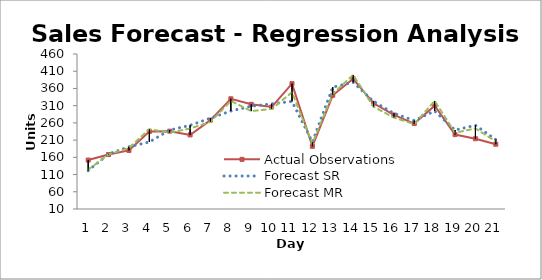
| Category | Actual Observations | Forecast SR | Forecast MR |
|---|---|---|---|
| 0 | 152 | 121.39 | 124.35 |
| 1 | 168 | 169.881 | 168.39 |
| 2 | 180 | 190.663 | 187.263 |
| 3 | 235 | 204.518 | 241.838 |
| 4 | 236 | 239.154 | 231.303 |
| 5 | 225 | 253.009 | 243.885 |
| 6 | 268 | 273.791 | 262.759 |
| 7 | 330 | 294.572 | 323.625 |
| 8 | 314 | 308.427 | 294.216 |
| 9 | 306 | 315.354 | 300.507 |
| 10 | 374 | 322.282 | 348.79 |
| 11 | 192 | 204.518 | 199.846 |
| 12 | 340 | 363.845 | 344.546 |
| 13 | 388 | 377.7 | 399.121 |
| 14 | 317 | 322.282 | 306.798 |
| 15 | 283 | 287.645 | 275.342 |
| 16 | 258 | 266.863 | 256.468 |
| 17 | 310 | 294.572 | 323.625 |
| 18 | 226 | 239.154 | 231.303 |
| 19 | 214 | 253.009 | 243.885 |
| 20 | 198 | 211.445 | 206.137 |